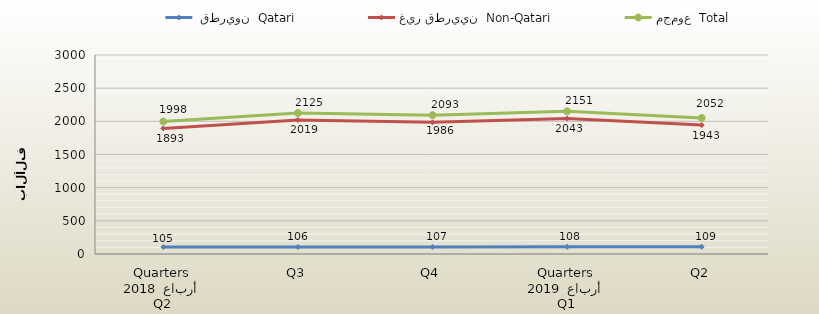
| Category |  قطريون  Qatari | غير قطريين  Non-Qatari | مجموع  Total |
|---|---|---|---|
| 0 | 105 | 1893 | 1998 |
| 1 | 106 | 2019 | 2125 |
| 2 | 107 | 1986 | 2093 |
| 3 | 108 | 2043 | 2151 |
| 4 | 109 | 1943 | 2052 |